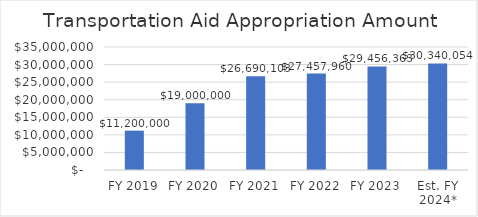
| Category | Transportation Aid Appropriation Amount |
|---|---|
| FY 2019 | 11200000 |
| FY 2020 | 19000000 |
| FY 2021 | 26690103 |
| FY 2022 | 27457960 |
| FY 2023 | 29456363.088 |
| Est. FY 2024* | 30340053.981 |